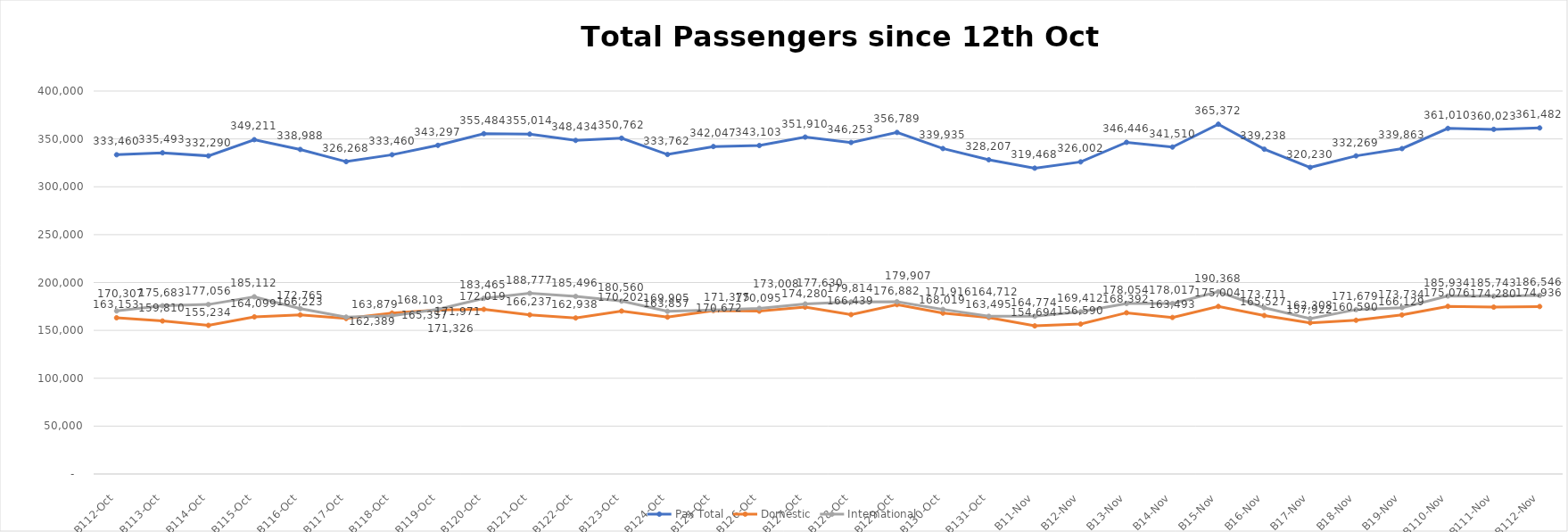
| Category | Pax Total | Domestic | International |
|---|---|---|---|
| 2023-10-12 | 333460 | 163153 | 170307 |
| 2023-10-13 | 335493 | 159810 | 175683 |
| 2023-10-14 | 332290 | 155234 | 177056 |
| 2023-10-15 | 349211 | 164099 | 185112 |
| 2023-10-16 | 338988 | 166223 | 172765 |
| 2023-10-17 | 326268 | 162389 | 163879 |
| 2023-10-18 | 333460 | 168103 | 165357 |
| 2023-10-19 | 343297 | 171326 | 171971 |
| 2023-10-20 | 355484 | 172019 | 183465 |
| 2023-10-21 | 355014 | 166237 | 188777 |
| 2023-10-22 | 348434 | 162938 | 185496 |
| 2023-10-23 | 350762 | 170202 | 180560 |
| 2023-10-24 | 333762 | 163857 | 169905 |
| 2023-10-25 | 342047 | 170672 | 171375 |
| 2023-10-26 | 343103 | 170095 | 173008 |
| 2023-10-27 | 351910 | 174280 | 177630 |
| 2023-10-28 | 346253 | 166439 | 179814 |
| 2023-10-29 | 356789 | 176882 | 179907 |
| 2023-10-30 | 339935 | 168019 | 171916 |
| 2023-10-31 | 328207 | 163495 | 164712 |
| 2023-11-01 | 319468 | 154694 | 164774 |
| 2023-11-02 | 326002 | 156590 | 169412 |
| 2023-11-03 | 346446 | 168392 | 178054 |
| 2023-11-04 | 341510 | 163493 | 178017 |
| 2023-11-05 | 365372 | 175004 | 190368 |
| 2023-11-06 | 339238 | 165527 | 173711 |
| 2023-11-07 | 320230 | 157922 | 162308 |
| 2023-11-08 | 332269 | 160590 | 171679 |
| 2023-11-09 | 339863 | 166129 | 173734 |
| 2023-11-10 | 361010 | 175076 | 185934 |
| 2023-11-11 | 360023 | 174280 | 185743 |
| 2023-11-12 | 361482 | 174936 | 186546 |